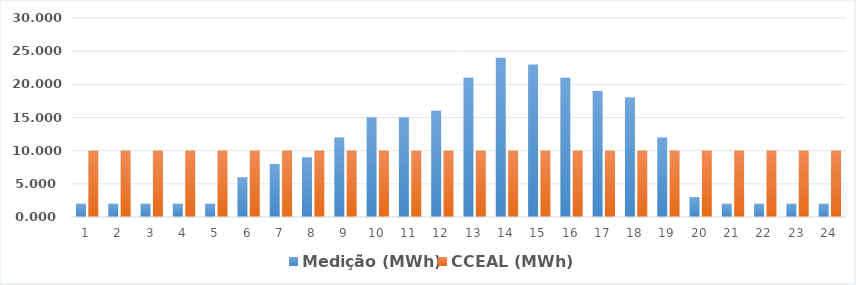
| Category | Medição (MWh) | CCEAL (MWh) |
|---|---|---|
| 0 | 2 | 10 |
| 1 | 2 | 10 |
| 2 | 2 | 10 |
| 3 | 2 | 10 |
| 4 | 2 | 10 |
| 5 | 6 | 10 |
| 6 | 8 | 10 |
| 7 | 9 | 10 |
| 8 | 12 | 10 |
| 9 | 15 | 10 |
| 10 | 15 | 10 |
| 11 | 16 | 10 |
| 12 | 21 | 10 |
| 13 | 24 | 10 |
| 14 | 23 | 10 |
| 15 | 21 | 10 |
| 16 | 19 | 10 |
| 17 | 18 | 10 |
| 18 | 12 | 10 |
| 19 | 3 | 10 |
| 20 | 2 | 10 |
| 21 | 2 | 10 |
| 22 | 2 | 10 |
| 23 | 2 | 10 |